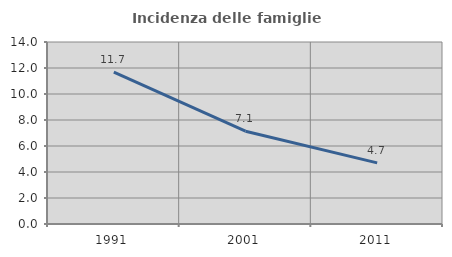
| Category | Incidenza delle famiglie numerose |
|---|---|
| 1991.0 | 11.682 |
| 2001.0 | 7.136 |
| 2011.0 | 4.7 |